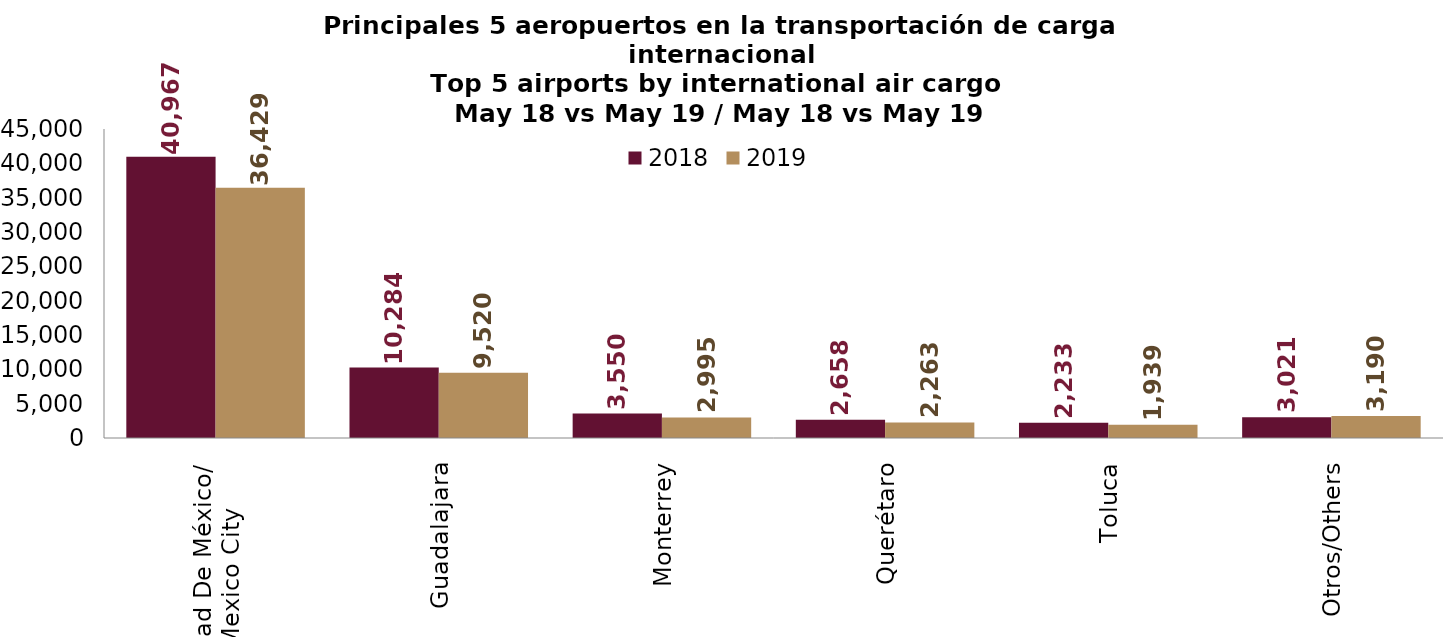
| Category | 2018 | 2019 |
|---|---|---|
| Ciudad De México/
Mexico City | 40967.07 | 36429.03 |
| Guadalajara | 10284.298 | 9520.227 |
| Monterrey | 3550.416 | 2994.657 |
| Querétaro | 2658.055 | 2263.086 |
| Toluca | 2233.288 | 1938.555 |
| Otros/Others | 3020.805 | 3189.81 |